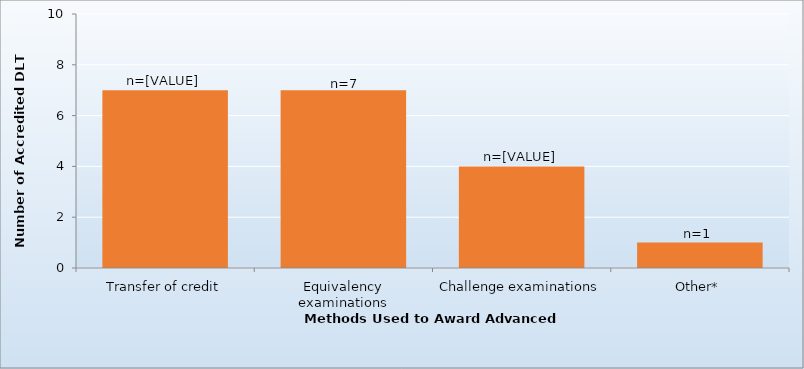
| Category | 2016-17 |
|---|---|
| Transfer of credit | 7 |
| Equivalency examinations | 7 |
| Challenge examinations | 4 |
| Other* | 1 |